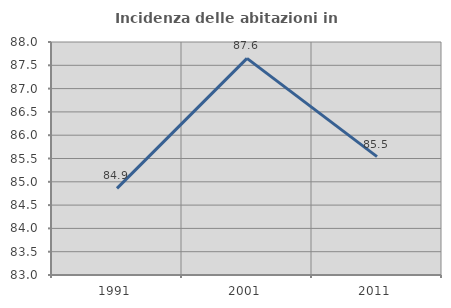
| Category | Incidenza delle abitazioni in proprietà  |
|---|---|
| 1991.0 | 84.858 |
| 2001.0 | 87.649 |
| 2011.0 | 85.54 |